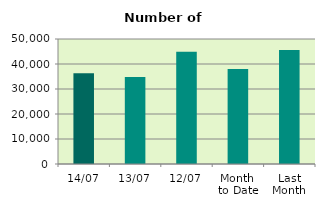
| Category | Series 0 |
|---|---|
| 14/07 | 36258 |
| 13/07 | 34796 |
| 12/07 | 44872 |
| Month 
to Date | 38033 |
| Last
Month | 45645.364 |